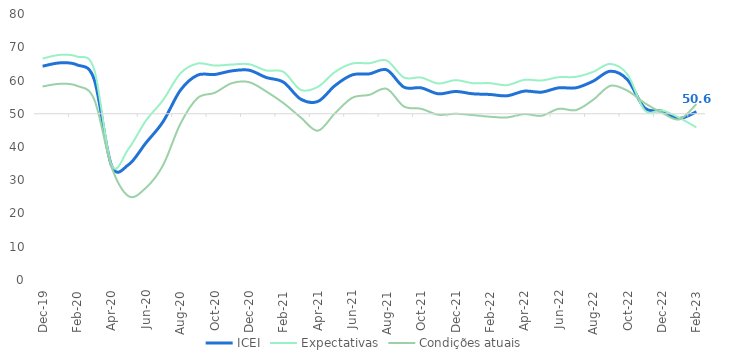
| Category | ICEI | Expectativas | Condições atuais |
|---|---|---|---|
| 2019-12-01 | 64.3 | 66.6 | 58.2 |
| 2020-01-01 | 65.3 | 67.7 | 59 |
| 2020-02-01 | 64.7 | 67.2 | 58.4 |
| 2020-03-01 | 60.3 | 63.3 | 54.3 |
| 2020-04-01 | 34.5 | 34.7 | 34.1 |
| 2020-05-01 | 34.7 | 39.5 | 25.2 |
| 2020-06-01 | 41.2 | 47.9 | 27.7 |
| 2020-07-01 | 47.6 | 54.1 | 34.5 |
| 2020-08-01 | 57 | 62.1 | 46.9 |
| 2020-09-01 | 61.6 | 65.1 | 54.7 |
| 2020-10-01 | 61.8 | 64.5 | 56.3 |
| 2020-11-01 | 62.9 | 64.8 | 59.2 |
| 2020-12-01 | 63.1 | 64.9 | 59.5 |
| 2021-01-01 | 60.9 | 63 | 56.7 |
| 2021-02-01 | 59.5 | 62.6 | 53.2 |
| 2021-03-01 | 54.4 | 57.2 | 48.9 |
| 2021-04-01 | 53.7 | 58.1 | 44.9 |
| 2021-05-01 | 58.5 | 62.6 | 50.2 |
| 2021-06-01 | 61.7 | 65.1 | 54.8 |
| 2021-07-01 | 62 | 65.2 | 55.7 |
| 2021-08-01 | 63.2 | 66 | 57.5 |
| 2021-09-01 | 58 | 60.9 | 52.2 |
| 2021-10-01 | 57.8 | 60.9 | 51.5 |
| 2021-11-01 | 56 | 59.1 | 49.7 |
| 2021-12-01 | 56.7 | 60.1 | 50 |
| 2022-01-01 | 56 | 59.2 | 49.6 |
| 2022-02-01 | 55.8 | 59.2 | 49.1 |
| 2022-03-01 | 55.4 | 58.6 | 48.9 |
| 2022-04-01 | 56.8 | 60.2 | 49.9 |
| 2022-05-01 | 56.5 | 60 | 49.4 |
| 2022-06-01 | 57.8 | 61 | 51.5 |
| 2022-07-01 | 57.8 | 61.1 | 51.1 |
| 2022-08-01 | 59.8 | 62.6 | 54.2 |
| 2022-09-01 | 62.8 | 65 | 58.4 |
| 2022-10-01 | 60.2 | 61.8 | 56.9 |
| 2022-11-01 | 51.7 | 51 | 53.2 |
| 2022-12-01 | 50.8 | 51 | 50.3 |
| 2023-01-01 | 48.6 | 48.8 | 48.3 |
| 2023-02-01 | 50.6 | 45.9 | 52.9 |